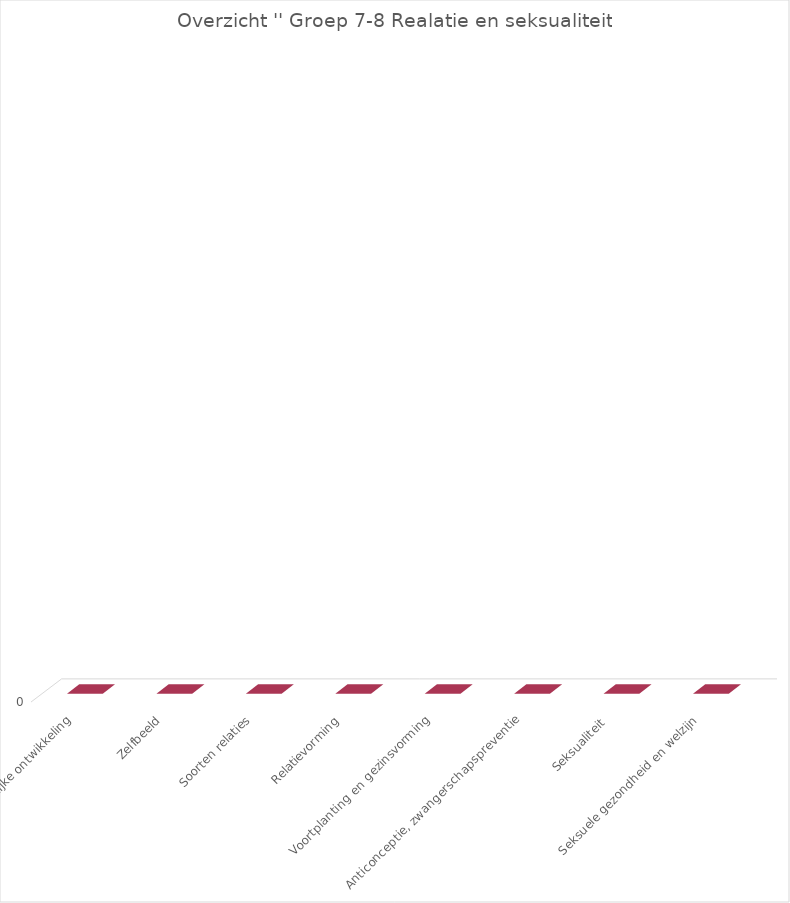
| Category | Series 2 |
|---|---|
| Lichamelijke ontwikkeling | 0 |
| Zelfbeeld | 0 |
| Soorten relaties | 0 |
| Relatievorming | 0 |
| Voortplanting en gezinsvorming | 0 |
| Anticonceptie, zwangerschapspreventie | 0 |
| Seksualiteit  | 0 |
| Seksuele gezondheid en welzijn | 0 |